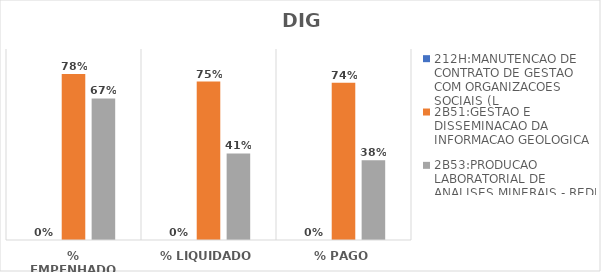
| Category | 212H:MANUTENCAO DE CONTRATO DE GESTAO COM ORGANIZACOES SOCIAIS (L | 2B51:GESTAO E DISSEMINACAO DA INFORMACAO GEOLOGICA | 2B53:PRODUCAO LABORATORIAL DE ANALISES MINERAIS - REDE LAMIN |
|---|---|---|---|
| % EMPENHADO | 0 | 0.782 | 0.667 |
| % LIQUIDADO | 0 | 0.746 | 0.408 |
| % PAGO | 0 | 0.741 | 0.376 |